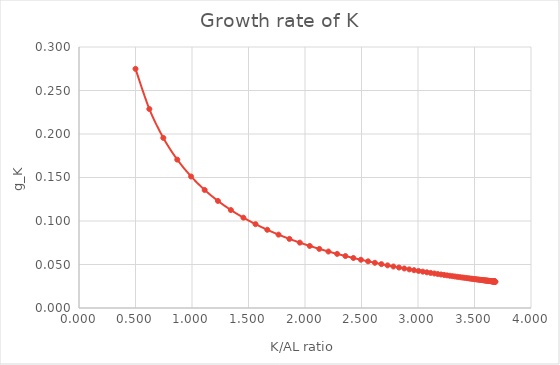
| Category | g_K |
|---|---|
| 0.5 | 0.275 |
| 0.6224504792712471 | 0.229 |
| 0.7461392439680217 | 0.196 |
| 0.8696272211492531 | 0.171 |
| 0.9918487985207934 | 0.151 |
| 1.1120104207860702 | 0.136 |
| 1.2295222946336108 | 0.123 |
| 1.3439503658009655 | 0.113 |
| 1.4549813945681864 | 0.104 |
| 1.562396871983095 | 0.096 |
| 1.6660531206310594 | 0.09 |
| 1.7658658521259931 | 0.084 |
| 1.8617980168347672 | 0.079 |
| 1.9538501368465186 | 0.075 |
| 2.042052545284003 | 0.071 |
| 2.126459111127093 | 0.068 |
| 2.207142136446118 | 0.065 |
| 2.2841881890354405 | 0.062 |
| 2.3576946882990515 | 0.06 |
| 2.427767102525106 | 0.057 |
| 2.4945166457573036 | 0.055 |
| 2.558058385250909 | 0.054 |
| 2.6185096879882104 | 0.052 |
| 2.675988948313662 | 0.05 |
| 2.730614549417853 | 0.049 |
| 2.7825040198600868 | 0.048 |
| 2.8317733530881783 | 0.047 |
| 2.8785364633728103 | 0.045 |
| 2.9229047560078234 | 0.044 |
| 2.964986793253106 | 0.043 |
| 3.0048880404783445 | 0.043 |
| 3.042710679431188 | 0.042 |
| 3.078553477601619 | 0.041 |
| 3.112511704363441 | 0.04 |
| 3.1446770860055273 | 0.04 |
| 3.1751377929690747 | 0.039 |
| 3.2039784536220264 | 0.039 |
| 3.231280189760143 | 0.038 |
| 3.2571206697517816 | 0.038 |
| 3.2815741758616004 | 0.037 |
| 3.3047116828145673 | 0.037 |
| 3.3266009451102656 | 0.036 |
| 3.3473065909804656 | 0.036 |
| 3.366890221210307 | 0.036 |
| 3.3854105113234616 | 0.035 |
| 3.402923315871402 | 0.035 |
| 3.4194817737722016 | 0.035 |
| 3.4351364138201594 | 0.034 |
| 3.449935259638181 | 0.034 |
| 3.4639239334738368 | 0.034 |
| 3.477145758350398 | 0.034 |
| 3.4896418581785578 | 0.033 |
| 3.501451255515151 | 0.033 |
| 3.5126109667239658 | 0.033 |
| 3.5231560943522577 | 0.033 |
| 3.5331199165863194 | 0.033 |
| 3.5425339736915626 | 0.033 |
| 3.5514281513781403 | 0.032 |
| 3.559830761063035 | 0.032 |
| 3.567768617024577 | 0.032 |
| 3.5752671104661746 | 0.032 |
| 3.5823502805232637 | 0.032 |
| 3.5890408822615556 | 0.032 |
| 3.5953604517261204 | 0.032 |
| 3.6013293681099317 | 0.032 |
| 3.606966913117685 | 0.031 |
| 3.6122913276061652 | 0.031 |
| 3.6173198655864938 | 0.031 |
| 3.622068845676404 | 0.031 |
| 3.626553700092485 | 0.031 |
| 3.6307890212732565 | 0.031 |
| 3.6347886062241237 | 0.031 |
| 3.6385654986748293 | 0.031 |
| 3.642132029139095 | 0.031 |
| 3.645499852964782 | 0.031 |
| 3.648679986461221 | 0.031 |
| 3.6516828411883844 | 0.031 |
| 3.6545182564904017 | 0.031 |
| 3.6571955303535773 | 0.031 |
| 3.659723448666577 | 0.031 |
| 3.6621103129579256 | 0.031 |
| 3.664363966683307 | 0.031 |
| 3.6664918201325376 | 0.031 |
| 3.6685008740234157 | 0.031 |
| 3.6703977418469997 | 0.03 |
| 3.672188671026251 | 0.03 |
| 3.6738795629473864 | 0.03 |
| 3.6754759919207523 | 0.03 |
| 3.6769832231255286 | 0.03 |
| 3.678406229590175 | 0.03 |
| 3.6797497082581585 | 0.03 |
| 3.6810180951862166 | 0.03 |
| 3.6822155799202116 | 0.03 |
| 3.6833461190914862 | 0.03 |
| 3.6844134492745746 | 0.03 |